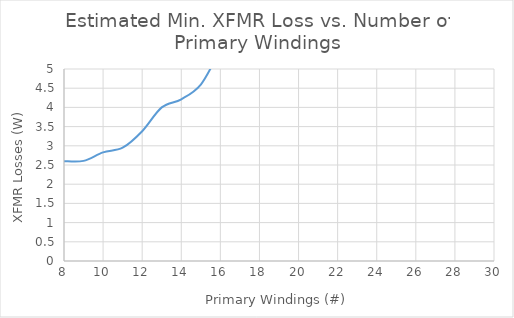
| Category | Losses |
|---|---|
| 8.0 | 2.6 |
| 9.0 | 2.608 |
| 10.0 | 2.83 |
| 11.0 | 2.95 |
| 12.0 | 3.38 |
| 13.0 | 4.001 |
| 14.0 | 4.211 |
| 15.0 | 4.596 |
| 16.0 | 5.451 |
| 17.0 | 5.976 |
| 18.0 | 6.287 |
| 19.0 | 8.036 |
| 20.0 | 8.431 |
| 21.0 | 8.829 |
| 22.0 | 9.229 |
| 23.0 | 10.219 |
| 24.0 | 12.937 |
| 25.0 | 13.463 |
| 26.0 | 13.99 |
| 27.0 | 14.518 |
| 28.0 | 16.121 |
| 29.0 | 16.689 |
| 30.0 | 17.257 |
| 31.0 | 17.826 |
| 32.0 | 18.395 |
| 33.0 | 18.965 |
| 34.0 | 26.018 |
| 35.0 | 26.779 |
| 36.0 | 29.844 |
| 37.0 | 30.669 |
| 38.0 | 31.495 |
| 39.0 | 32.321 |
| 40.0 | 33.147 |
| 41.0 | 33.973 |
| 42.0 | 34.8 |
| 43.0 | 35.626 |
| 44.0 | 36.453 |